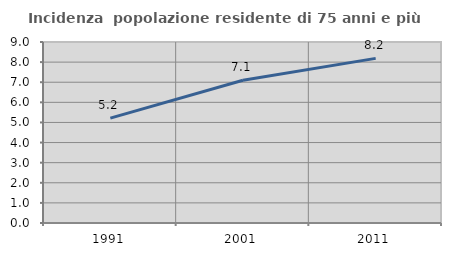
| Category | Incidenza  popolazione residente di 75 anni e più |
|---|---|
| 1991.0 | 5.212 |
| 2001.0 | 7.095 |
| 2011.0 | 8.186 |